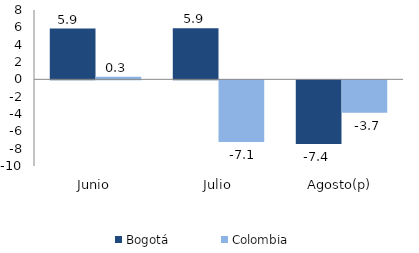
| Category | Bogotá | Colombia |
|---|---|---|
| Junio | 5.854 | 0.307 |
| Julio | 5.908 | -7.105 |
| Agosto(p) | -7.351 | -3.728 |